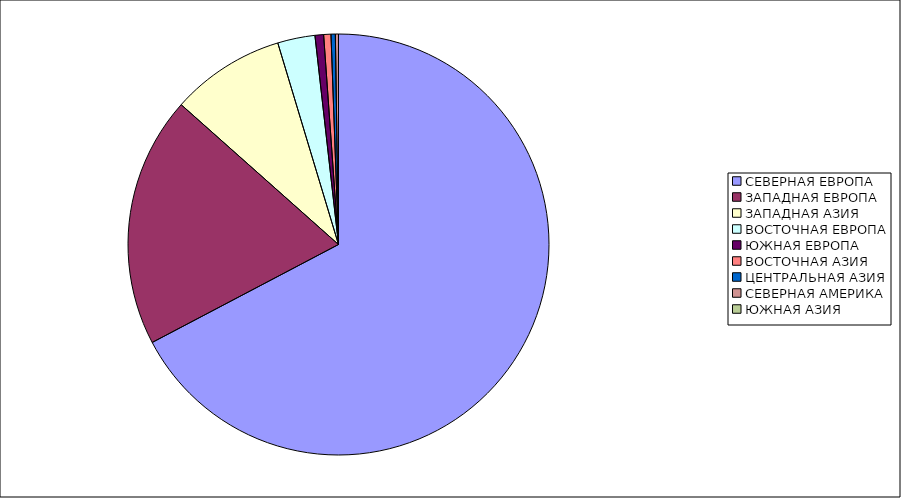
| Category | Оборот |
|---|---|
| СЕВЕРНАЯ ЕВРОПА | 67.295 |
| ЗАПАДНАЯ ЕВРОПА | 19.268 |
| ЗАПАДНАЯ АЗИЯ | 8.78 |
| ВОСТОЧНАЯ ЕВРОПА | 2.869 |
| ЮЖНАЯ ЕВРОПА | 0.661 |
| ВОСТОЧНАЯ АЗИЯ | 0.558 |
| ЦЕНТРАЛЬНАЯ АЗИЯ | 0.331 |
| СЕВЕРНАЯ АМЕРИКА | 0.237 |
| ЮЖНАЯ АЗИЯ | 0.001 |